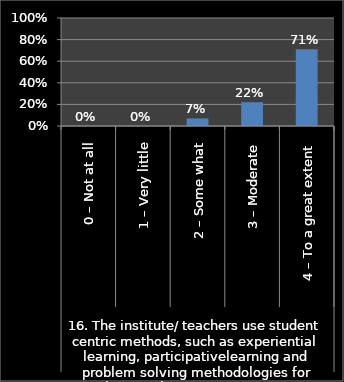
| Category | Series 0 |
|---|---|
| 0 | 0 |
| 1 | 0 |
| 2 | 0.07 |
| 3 | 0.22 |
| 4 | 0.71 |